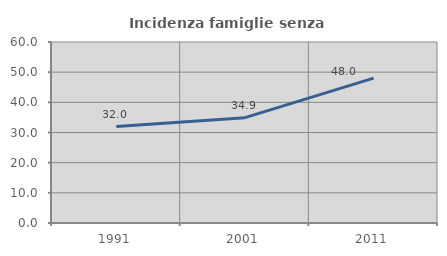
| Category | Incidenza famiglie senza nuclei |
|---|---|
| 1991.0 | 31.967 |
| 2001.0 | 34.914 |
| 2011.0 | 48.02 |